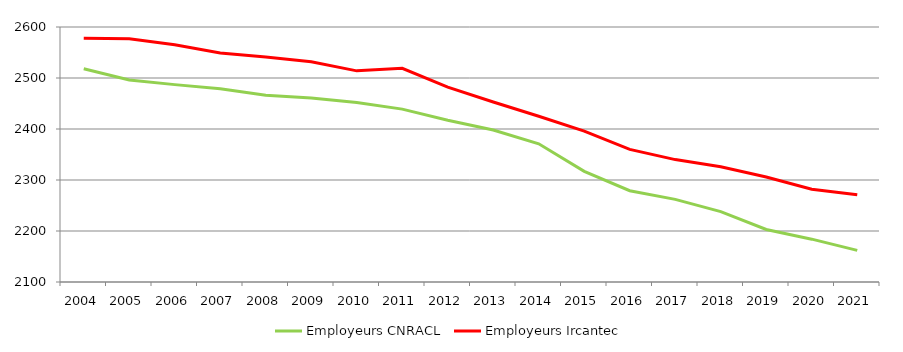
| Category | Employeurs CNRACL | Employeurs Ircantec |
|---|---|---|
| 2004.0 | 2518 | 2578 |
| 2005.0 | 2496 | 2577 |
| 2006.0 | 2487 | 2565 |
| 2007.0 | 2479 | 2549 |
| 2008.0 | 2466 | 2541 |
| 2009.0 | 2461 | 2532 |
| 2010.0 | 2452 | 2514 |
| 2011.0 | 2439 | 2519 |
| 2012.0 | 2417 | 2482 |
| 2013.0 | 2398 | 2453 |
| 2014.0 | 2371 | 2425 |
| 2015.0 | 2317 | 2396 |
| 2016.0 | 2279 | 2360 |
| 2017.0 | 2262 | 2340 |
| 2018.0 | 2238 | 2326 |
| 2019.0 | 2203 | 2306 |
| 2020.0 | 2184 | 2282 |
| 2021.0 | 2162 | 2271 |